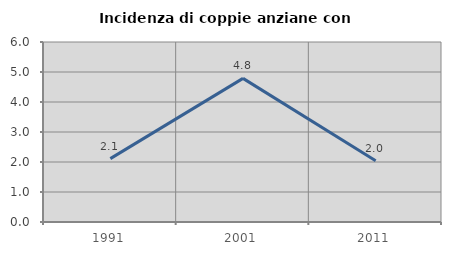
| Category | Incidenza di coppie anziane con figli |
|---|---|
| 1991.0 | 2.113 |
| 2001.0 | 4.787 |
| 2011.0 | 2.041 |